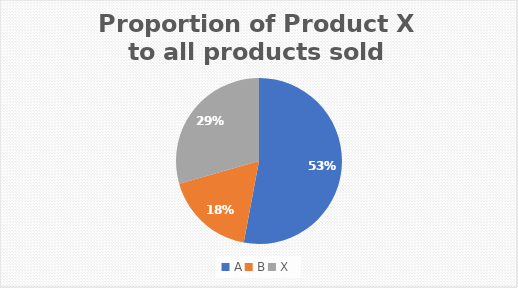
| Category | Proportion of Product X to all products sold |
|---|---|
| A | 27 |
| B | 9 |
| X | 15 |